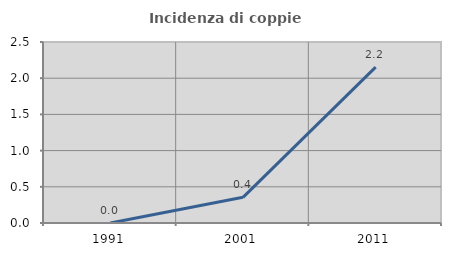
| Category | Incidenza di coppie miste |
|---|---|
| 1991.0 | 0 |
| 2001.0 | 0.355 |
| 2011.0 | 2.154 |